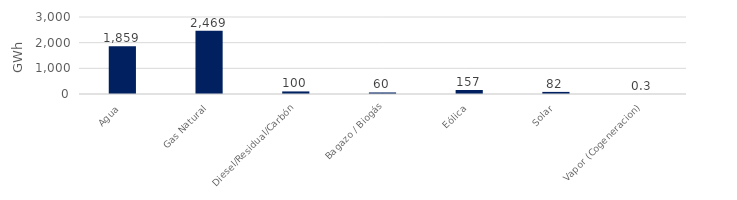
| Category | Series 0 |
|---|---|
| Agua | 1859.327 |
| Gas Natural | 2469.087 |
| Diesel/Residual/Carbón | 100.224 |
| Bagazo / Biogás | 60.133 |
| Eólica | 156.77 |
| Solar | 81.518 |
| Vapor (Cogeneracion) | 0.301 |